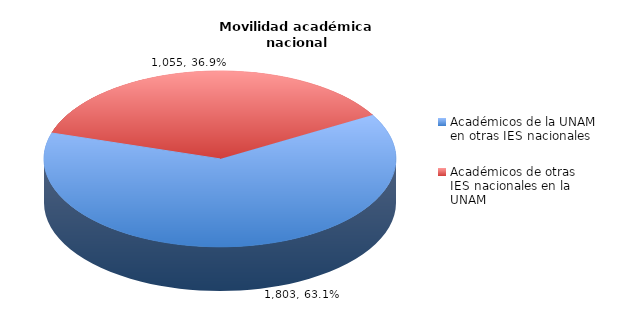
| Category | Series 0 |
|---|---|
| Académicos de la UNAM en otras IES nacionales | 1803 |
| Académicos de otras IES nacionales en la UNAM | 1055 |